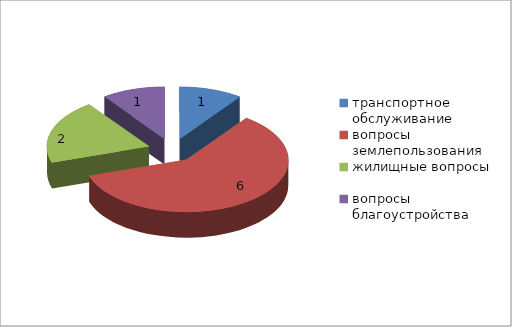
| Category | Series 0 |
|---|---|
| транспортное обслуживание | 1 |
| вопросы землепользования | 6 |
| жилищные вопросы | 2 |
| вопросы благоустройства | 1 |